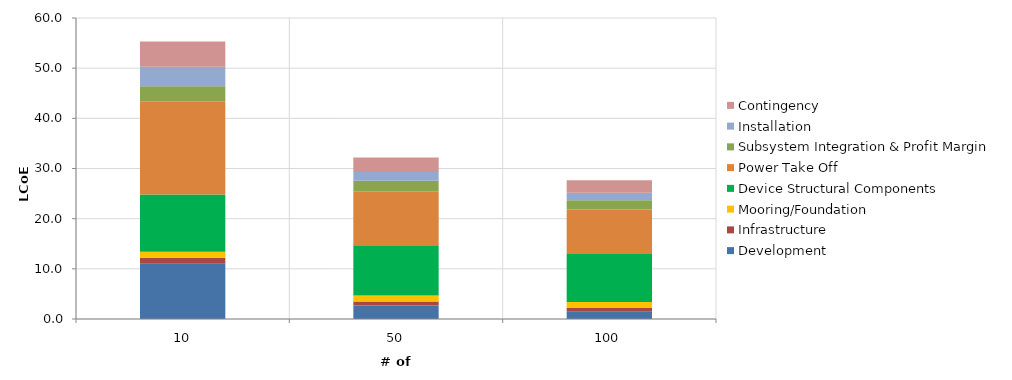
| Category | Development | Infrastructure | Mooring/Foundation | Device Structural Components | Power Take Off | Subsystem Integration & Profit Margin | Installation | Contingency |
|---|---|---|---|---|---|---|---|---|
| 10.0 | 11.007 | 1.205 | 1.195 | 11.422 | 18.575 | 3 | 3.862 | 5.027 |
| 50.0 | 2.681 | 0.796 | 1.195 | 10.026 | 10.788 | 2.081 | 1.713 | 2.928 |
| 100.0 | 1.425 | 0.77 | 1.195 | 9.695 | 8.751 | 1.845 | 1.483 | 2.516 |